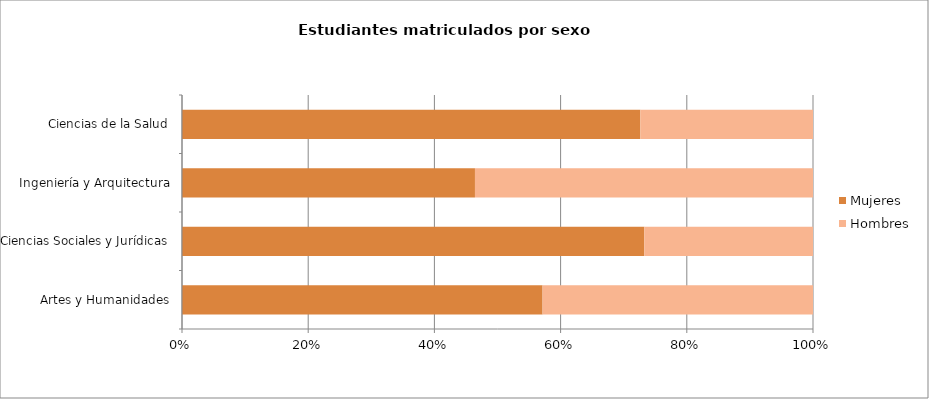
| Category | Mujeres | Hombres |
|---|---|---|
| Artes y Humanidades | 4 | 3 |
| Ciencias Sociales y Jurídicas | 74 | 27 |
| Ingeniería y Arquitectura | 13 | 15 |
| Ciencias de la Salud | 146 | 55 |